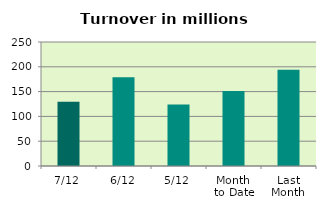
| Category | Series 0 |
|---|---|
| 7/12 | 129.763 |
| 6/12 | 178.825 |
| 5/12 | 123.804 |
| Month 
to Date | 151.385 |
| Last
Month | 193.997 |